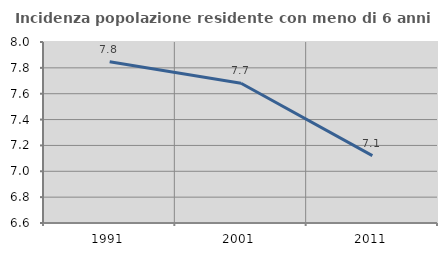
| Category | Incidenza popolazione residente con meno di 6 anni |
|---|---|
| 1991.0 | 7.848 |
| 2001.0 | 7.681 |
| 2011.0 | 7.121 |